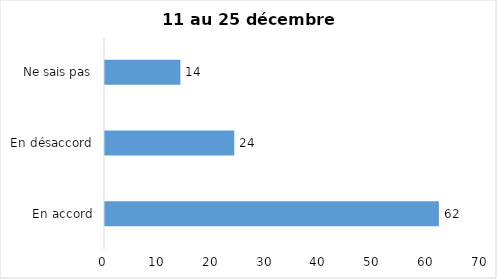
| Category | Series 0 |
|---|---|
| En accord | 62 |
| En désaccord | 24 |
| Ne sais pas | 14 |